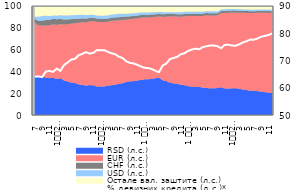
| Category | % девизних кредита (д.с.)* |
|---|---|
| 7 | 64.055 |
| 8 | 64.171 |
| 9 | 63.907 |
| 10 | 65.922 |
| 11 | 66.206 |
| 12 | 65.797 |
| 1
2009. | 67.033 |
| 2 | 66.194 |
| 3 | 68.332 |
| 4 | 69.274 |
| 5 | 70.344 |
| 6 | 70.595 |
| 7 | 71.934 |
| 8 | 72.393 |
| 9 | 73.056 |
| 10 | 72.555 |
| 11 | 72.787 |
| 12 | 73.817 |
| 1
2010. | 73.743 |
| 2 | 73.793 |
| 3 | 73.171 |
| 4 | 72.659 |
| 5 | 72.292 |
| 6 | 71.403 |
| 7 | 70.924 |
| 8 | 69.744 |
| 9 | 69.145 |
| 10 | 68.947 |
| 11 | 68.454 |
| 12 | 67.842 |
| 1 
2011. | 67.306 |
| 2 | 67.263 |
| 3 | 66.858 |
| 4 | 66.247 |
| 5 | 65.701 |
| 6 | 68.132 |
| 7 | 68.87 |
| 8 | 70.514 |
| 9 | 70.927 |
| 10 | 71.351 |
| 11 | 72.316 |
| 12 | 72.663 |
| 1 
2012. | 73.555 |
| 2 | 74.007 |
| 3 | 74.344 |
| 4 | 74.104 |
| 5 | 74.938 |
| 6 | 75.238 |
| 7 | 75.49 |
| 8 | 75.5 |
| 9 | 75.267 |
| 10 | 74.478 |
| 11 | 75.717 |
| 12 | 75.775 |
| 1
2013. | 75.486 |
| 2 | 75.398 |
| 3 | 75.959 |
| 4 | 76.634 |
| 5 | 77.086 |
| 6 | 77.675 |
| 7 | 77.624 |
| 8 | 78.09 |
| 9 | 78.724 |
| 10 | 79.044 |
| 11 | 79.373 |
| 12 | 79.964 |